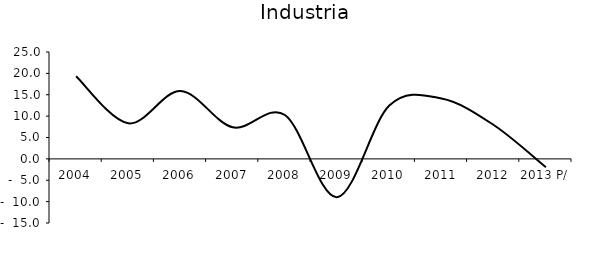
| Category | Industria |
|---|---|
| 2004 | 19.321 |
| 2005 | 8.312 |
| 2006 | 15.873 |
| 2007 | 7.38 |
| 2008 | 10.269 |
| 2009 | -8.96 |
| 2010 | 12.467 |
| 2011 | 14.129 |
| 2012 | 7.924 |
| 2013 P/ | -1.946 |